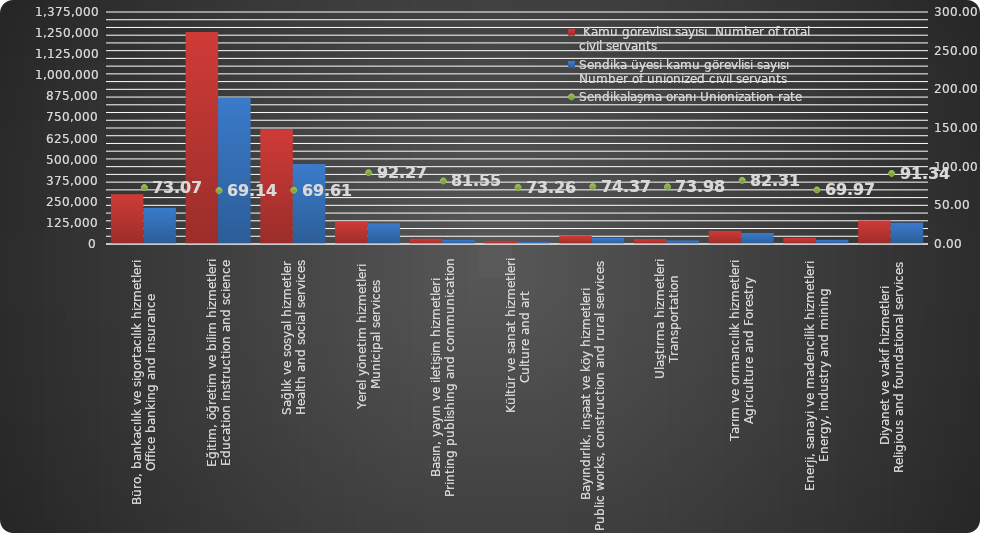
| Category |  Kamu görevlisi sayısı | Sendika üyesi kamu görevlisi sayısı |
|---|---|---|
| Büro, bankacılık ve sigortacılık hizmetleri
Office banking and insurance  | 294141 | 214925 |
| Eğitim, öğretim ve bilim hizmetleri
Education instruction and science  | 1256576 | 868848 |
| Sağlık ve sosyal hizmetler
Health and social services | 680785 | 473861 |
| Yerel yönetim hizmetleri 
Municipal services | 133765 | 123426 |
| Basın, yayın ve iletişim hizmetleri
Printing publishing and communication   | 30649 | 24994 |
| Kültür ve sanat hizmetleri
Culture and art  | 19966 | 14628 |
| Bayındırlık, inşaat ve köy hizmetleri
Public works, construction and rural services   | 46964 | 34925 |
| Ulaştırma hizmetleri
Transportation | 28843 | 21337 |
| Tarım ve ormancılık hizmetleri
Agriculture and Forestry  | 78600 | 64696 |
| Enerji, sanayi ve madencilik hizmetleri
Energy, industry and mining  | 37014 | 25897 |
| Diyanet ve vakıf hizmetleri
Religious and foundational services  | 139378 | 127308 |